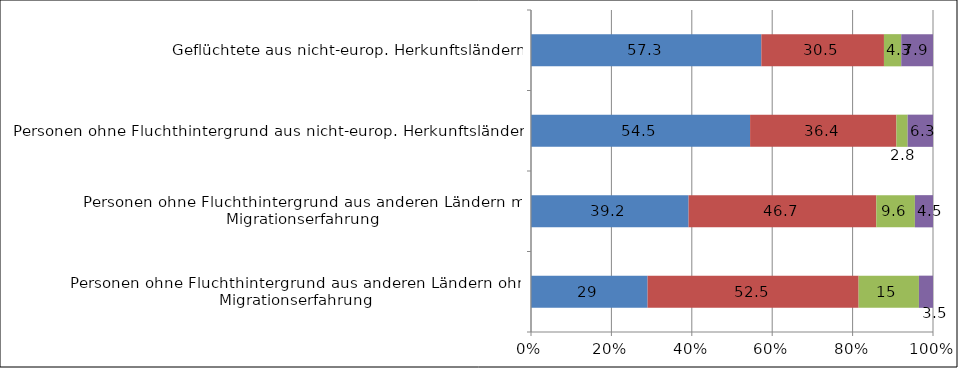
| Category | mind. 9 Schuljahre - Hauptschulabschluss | mind 10 Schuljahre - mittlerer Abschluss | mind. 11 Schuljahre - Studienberechtigung | k.A./nicht zuordenbar |
|---|---|---|---|---|
| Personen ohne Fluchthintergrund aus anderen Ländern ohne Migrationserfahrung | 29 | 52.5 | 15 | 3.5 |
| Personen ohne Fluchthintergrund aus anderen Ländern mit Migrationserfahrung | 39.2 | 46.7 | 9.6 | 4.5 |
| Personen ohne Fluchthintergrund aus nicht-europ. Herkunftsländern | 54.5 | 36.4 | 2.8 | 6.3 |
| Geflüchtete aus nicht-europ. Herkunftsländern | 57.3 | 30.5 | 4.3 | 7.9 |